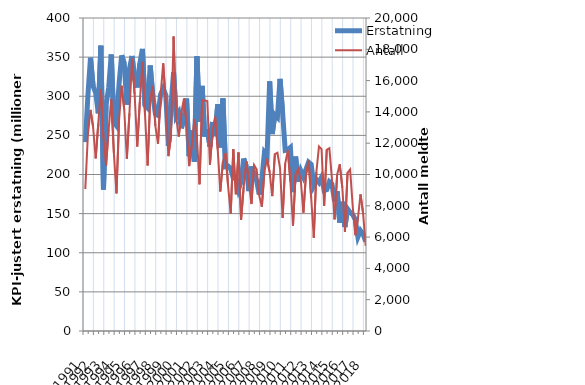
| Category | Erstatning |
|---|---|
| 1991.0 | 241.512 |
| nan | 300.484 |
| nan | 349.229 |
| nan | 312.784 |
| 1992.0 | 304.478 |
| nan | 278.208 |
| nan | 364.59 |
| nan | 180.822 |
| 1993.0 | 288.461 |
| nan | 310.805 |
| nan | 353.36 |
| nan | 266.815 |
| 1994.0 | 262.274 |
| nan | 315.803 |
| nan | 352.253 |
| nan | 341.743 |
| 1995.0 | 289.353 |
| nan | 334.727 |
| nan | 351.511 |
| nan | 321.88 |
| 1996.0 | 311.182 |
| nan | 341.606 |
| nan | 360.422 |
| nan | 288.15 |
| 1997.0 | 284.885 |
| nan | 339.314 |
| nan | 300.337 |
| nan | 277.65 |
| 1998.0 | 275.579 |
| nan | 302.306 |
| nan | 309.99 |
| nan | 301.649 |
| 1999.0 | 236.975 |
| nan | 287.546 |
| nan | 330.467 |
| nan | 274.094 |
| 2000.0 | 279.396 |
| nan | 259.108 |
| nan | 271.791 |
| nan | 297.135 |
| 2001.0 | 223.442 |
| nan | 256.28 |
| nan | 216.416 |
| nan | 351.008 |
| 2002.0 | 267.246 |
| nan | 313.315 |
| nan | 248.469 |
| nan | 257.968 |
| 2003.0 | 235.696 |
| nan | 267.073 |
| nan | 249.034 |
| nan | 289.563 |
| 2004.0 | 234.508 |
| nan | 297.283 |
| nan | 210.036 |
| nan | 210.913 |
| 2005.0 | 207.315 |
| nan | 195.391 |
| nan | 196.202 |
| nan | 180.683 |
| 2006.0 | 190.639 |
| nan | 220.461 |
| nan | 210.264 |
| nan | 178.732 |
| 2007.0 | 210.283 |
| nan | 200.876 |
| nan | 191.579 |
| nan | 174.481 |
| 2008.0 | 193.854 |
| nan | 227.933 |
| nan | 223.378 |
| nan | 319.11 |
| 2009.0 | 251.747 |
| nan | 276.295 |
| nan | 272.836 |
| nan | 322.248 |
| 2010.0 | 278.8 |
| nan | 230.847 |
| nan | 231.794 |
| nan | 234.558 |
| 2011.0 | 177.415 |
| nan | 222.865 |
| nan | 190.831 |
| nan | 204.834 |
| 2012.0 | 196.954 |
| nan | 206.447 |
| nan | 215.756 |
| nan | 212.921 |
| 2013.0 | 186.273 |
| nan | 193.614 |
| nan | 189.634 |
| nan | 196.473 |
| 2014.0 | 179.514 |
| nan | 180.663 |
| nan | 190.729 |
| nan | 187.76 |
| 2015.0 | 165.698 |
| nan | 178.529 |
| nan | 138.58 |
| nan | 165.16 |
| 2016.0 | 133.009 |
| nan | 156.105 |
| nan | 151.513 |
| nan | 148.772 |
| 2017.0 | 142.307 |
| nan | 120.109 |
| nan | 128.261 |
| nan | 123.814 |
| 2018.0 | 114.373 |